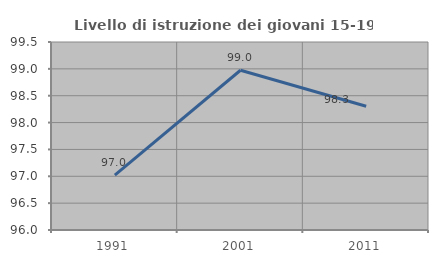
| Category | Livello di istruzione dei giovani 15-19 anni |
|---|---|
| 1991.0 | 97.02 |
| 2001.0 | 98.974 |
| 2011.0 | 98.305 |